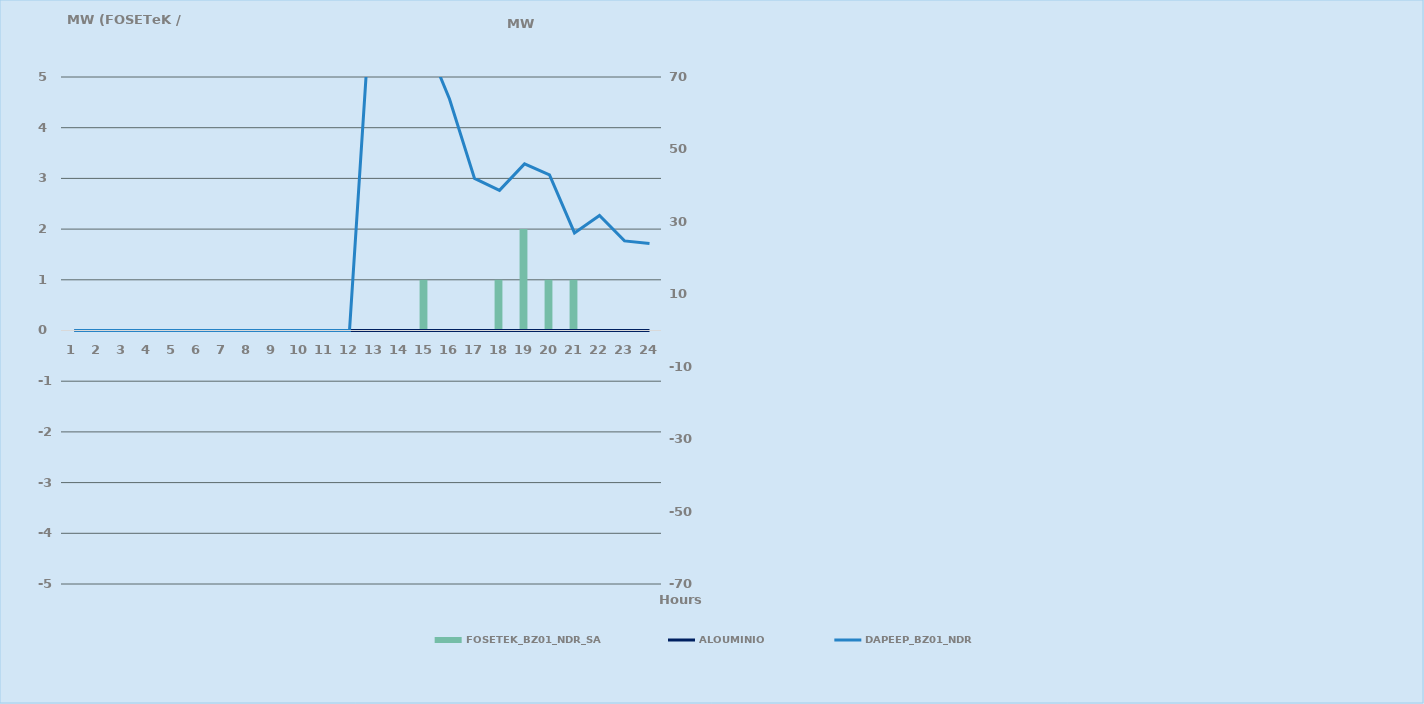
| Category | FOSETEK_BZ01_NDR_SA |
|---|---|
| 0 | 0 |
| 1 | 0 |
| 2 | 0 |
| 3 | 0 |
| 4 | 0 |
| 5 | 0 |
| 6 | 0 |
| 7 | 0 |
| 8 | 0 |
| 9 | 0 |
| 10 | 0 |
| 11 | 0 |
| 12 | 0 |
| 13 | 0 |
| 14 | 1 |
| 15 | 0 |
| 16 | 0 |
| 17 | 1 |
| 18 | 2 |
| 19 | 1 |
| 20 | 1 |
| 21 | 0 |
| 22 | 0 |
| 23 | 0 |